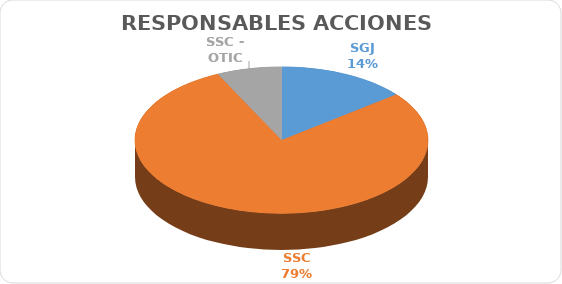
| Category | Series 0 |
|---|---|
| SGJ | 2 |
| SSC | 11 |
| SSC - OTIC | 1 |